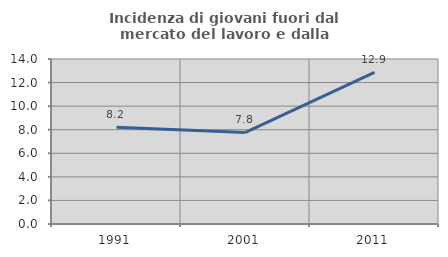
| Category | Incidenza di giovani fuori dal mercato del lavoro e dalla formazione  |
|---|---|
| 1991.0 | 8.204 |
| 2001.0 | 7.767 |
| 2011.0 | 12.86 |